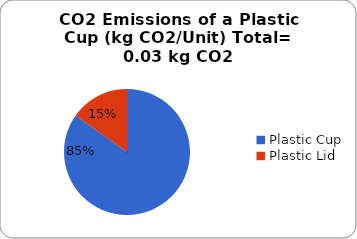
| Category | Series 0 |
|---|---|
| Plastic Cup  | 0.025 |
| Plastic Lid  | 0.005 |